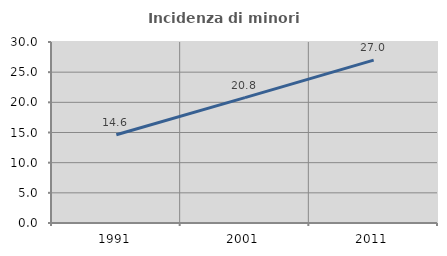
| Category | Incidenza di minori stranieri |
|---|---|
| 1991.0 | 14.634 |
| 2001.0 | 20.782 |
| 2011.0 | 26.987 |